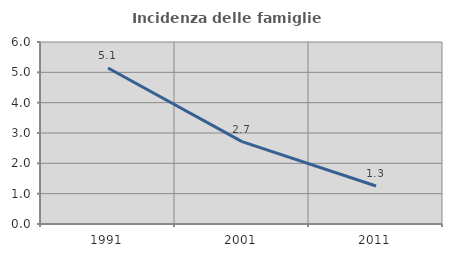
| Category | Incidenza delle famiglie numerose |
|---|---|
| 1991.0 | 5.145 |
| 2001.0 | 2.715 |
| 2011.0 | 1.253 |